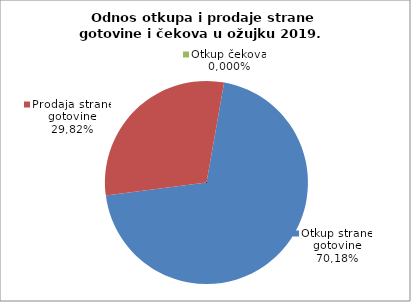
| Category | Otkup strane gotovine |
|---|---|
| 0 | 70.184 |
| 1 | 29.816 |
| 2 | 0 |